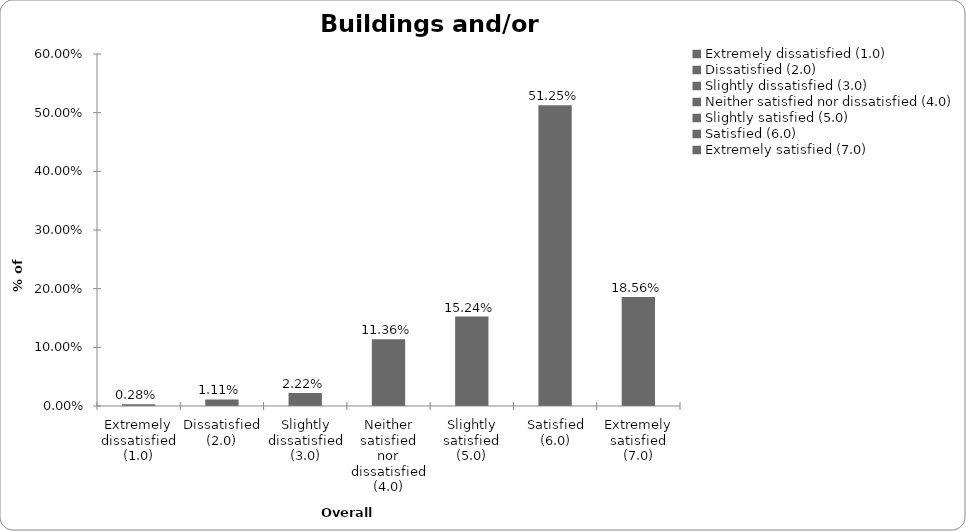
| Category | Series 0 |
|---|---|
| Extremely dissatisfied (1.0) | 0.003 |
| Dissatisfied (2.0) | 0.011 |
| Slightly dissatisfied (3.0) | 0.022 |
| Neither satisfied nor dissatisfied (4.0) | 0.114 |
| Slightly satisfied (5.0) | 0.152 |
| Satisfied (6.0) | 0.512 |
| Extremely satisfied (7.0) | 0.186 |